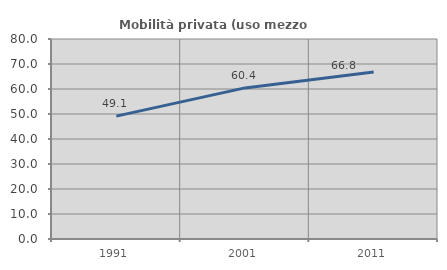
| Category | Mobilità privata (uso mezzo privato) |
|---|---|
| 1991.0 | 49.138 |
| 2001.0 | 60.44 |
| 2011.0 | 66.776 |